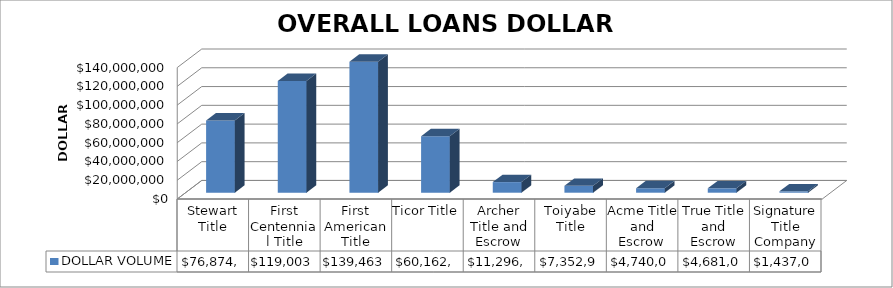
| Category | DOLLAR VOLUME |
|---|---|
| Stewart Title | 76874464 |
| First Centennial Title | 119003784.5 |
| First American Title | 139463544 |
| Ticor Title | 60162986 |
| Archer Title and Escrow | 11296238.5 |
| Toiyabe Title | 7352937 |
| Acme Title and Escrow | 4740095 |
| True Title and Escrow | 4681035 |
| Signature Title Company | 1437000 |